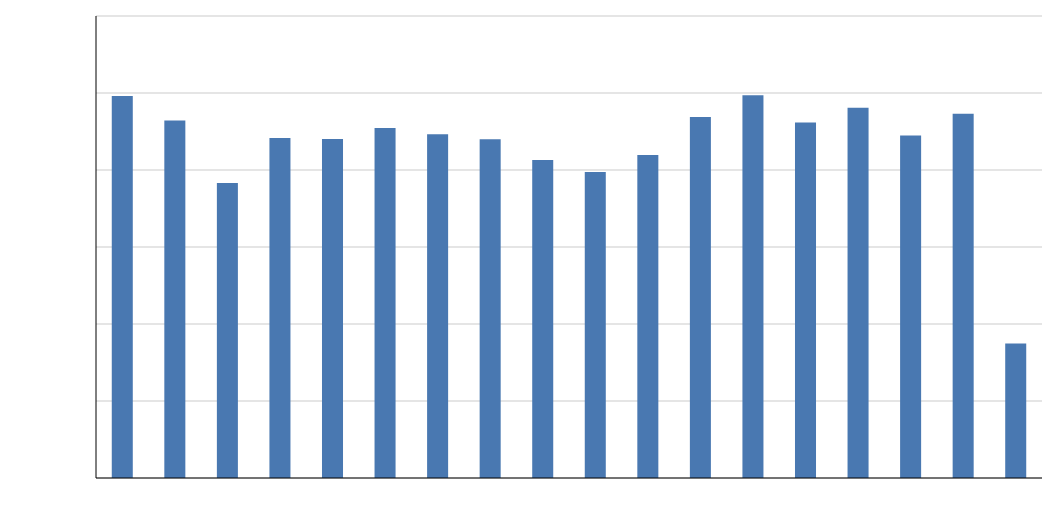
| Category | Processos |
|---|---|
| 2007 | 2480008 |
| 2008 | 2320877 |
| 2009 | 1914939 |
| 2010 | 2207877 |
| 2011 | 2201697 |
| 2012 | 2272299 |
| 2013 | 2232269 |
| 2014 | 2199779 |
| 2015 | 2064772 |
| 2016 | 1986418 |
| 2017 | 2097926 |
| 2018 | 2344734 |
| 2019 | 2485529 |
| 2020 | 2309103 |
| 2021 | 2404692 |
| 2022 | 2224766 |
| 2023 | 2365930 |
| 2024 | 872948 |